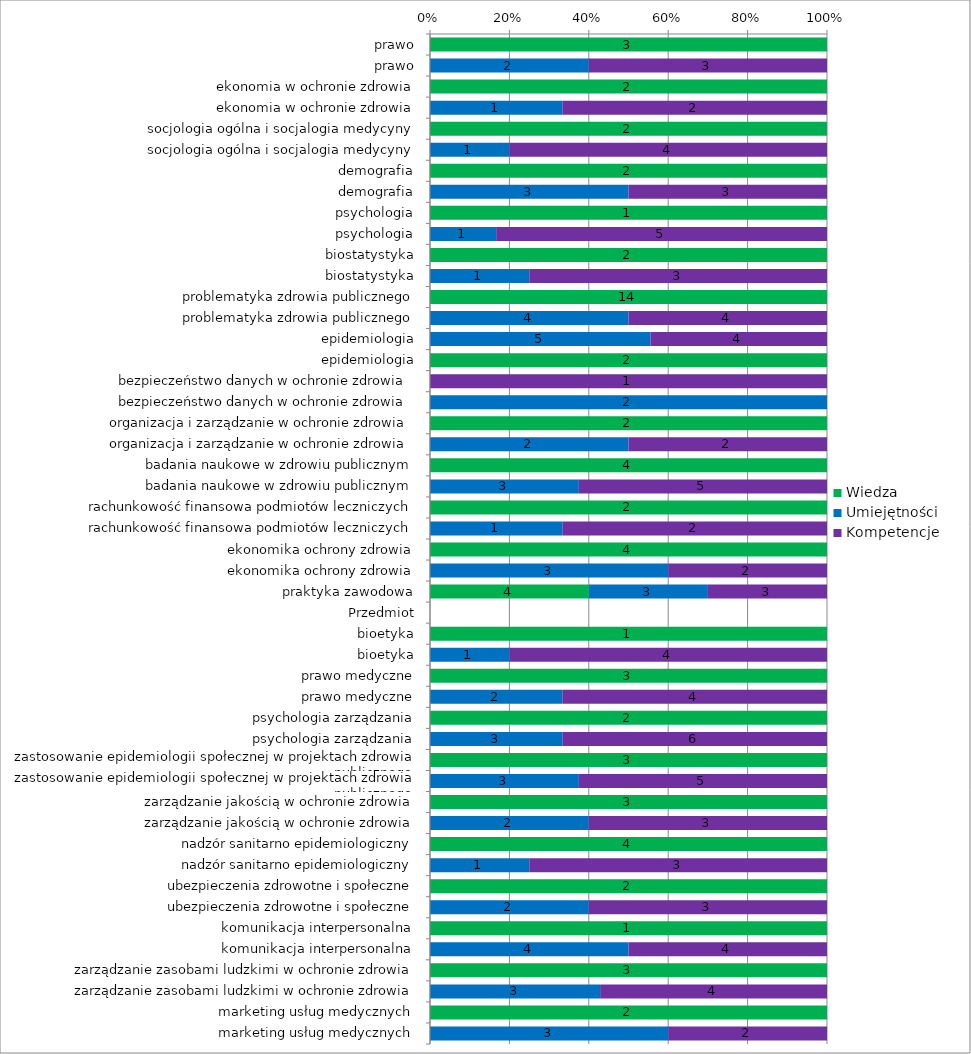
| Category | Wiedza | Umiejętności | Kompetencje |
|---|---|---|---|
|  prawo | 3 | 0 | 0 |
|  prawo | 0 | 2 | 3 |
|  ekonomia w ochronie zdrowia | 2 | 0 | 0 |
|  ekonomia w ochronie zdrowia | 0 | 1 | 2 |
|  socjologia ogólna i socjalogia medycyny | 2 | 0 | 0 |
|  socjologia ogólna i socjalogia medycyny | 0 | 1 | 4 |
|  demografia | 2 | 0 | 0 |
|  demografia | 0 | 3 | 3 |
|  psychologia | 1 | 0 | 0 |
|  psychologia | 0 | 1 | 5 |
|  biostatystyka | 2 | 0 | 0 |
|  biostatystyka | 0 | 1 | 3 |
| problematyka zdrowia publicznego | 14 | 0 | 0 |
| problematyka zdrowia publicznego | 0 | 4 | 4 |
| epidemiologia | 0 | 5 | 4 |
| epidemiologia | 2 | 0 | 0 |
| bezpieczeństwo danych w ochronie zdrowia  | 0 | 0 | 1 |
| bezpieczeństwo danych w ochronie zdrowia  | 0 | 2 | 0 |
| organizacja i zarządzanie w ochronie zdrowia  | 2 | 0 | 0 |
| organizacja i zarządzanie w ochronie zdrowia  | 0 | 2 | 2 |
| badania naukowe w zdrowiu publicznym | 4 | 0 | 0 |
| badania naukowe w zdrowiu publicznym | 0 | 3 | 5 |
| rachunkowość finansowa podmiotów leczniczych | 2 | 0 | 0 |
| rachunkowość finansowa podmiotów leczniczych | 0 | 1 | 2 |
| ekonomika ochrony zdrowia | 4 | 0 | 0 |
| ekonomika ochrony zdrowia | 0 | 3 | 2 |
| praktyka zawodowa | 4 | 3 | 3 |
| Przedmiot | 0 | 0 | 0 |
| bioetyka | 1 | 0 | 0 |
| bioetyka | 0 | 1 | 4 |
| prawo medyczne | 3 | 0 | 0 |
| prawo medyczne | 0 | 2 | 4 |
| psychologia zarządzania | 2 | 0 | 0 |
| psychologia zarządzania | 0 | 3 | 6 |
| zastosowanie epidemiologii społecznej w projektach zdrowia publicznego  | 3 | 0 | 0 |
| zastosowanie epidemiologii społecznej w projektach zdrowia publicznego  | 0 | 3 | 5 |
| zarządzanie jakością w ochronie zdrowia | 3 | 0 | 0 |
| zarządzanie jakością w ochronie zdrowia | 0 | 2 | 3 |
| nadzór sanitarno epidemiologiczny | 4 | 0 | 0 |
| nadzór sanitarno epidemiologiczny | 0 | 1 | 3 |
| ubezpieczenia zdrowotne i społeczne | 2 | 0 | 0 |
| ubezpieczenia zdrowotne i społeczne | 0 | 2 | 3 |
| komunikacja interpersonalna | 1 | 0 | 0 |
| komunikacja interpersonalna | 0 | 4 | 4 |
| zarządzanie zasobami ludzkimi w ochronie zdrowia | 3 | 0 | 0 |
| zarządzanie zasobami ludzkimi w ochronie zdrowia | 0 | 3 | 4 |
| marketing usług medycznych | 2 | 0 | 0 |
| marketing usług medycznych | 0 | 3 | 2 |